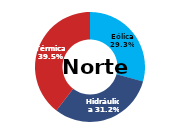
| Category | Norte |
|---|---|
| Eólica | 103.464 |
| Hidráulica | 110.274 |
| Solar | 0 |
| Térmica | 139.732 |